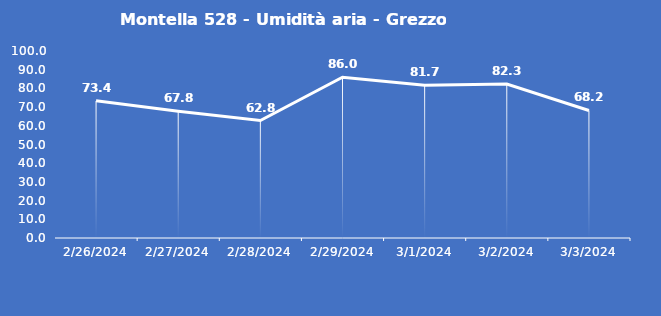
| Category | Montella 528 - Umidità aria - Grezzo (%) |
|---|---|
| 2/26/24 | 73.4 |
| 2/27/24 | 67.8 |
| 2/28/24 | 62.8 |
| 2/29/24 | 86 |
| 3/1/24 | 81.7 |
| 3/2/24 | 82.3 |
| 3/3/24 | 68.2 |